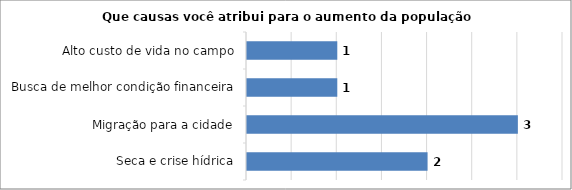
| Category | Series 0 |
|---|---|
| Seca e crise hídrica | 2 |
| Migração para a cidade | 3 |
| Busca de melhor condição financeira | 1 |
| Alto custo de vida no campo | 1 |